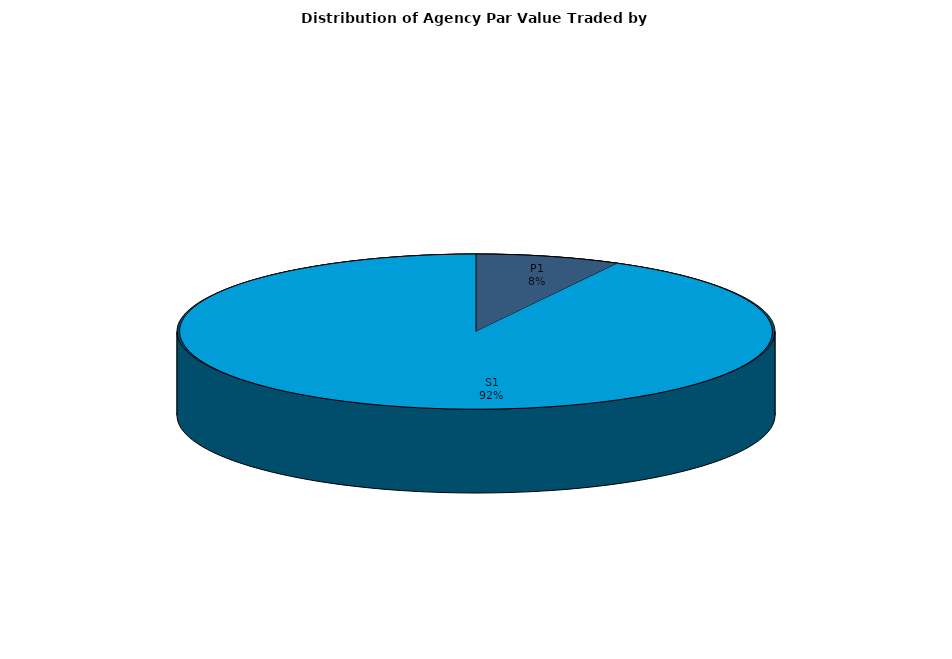
| Category | Series 0 |
|---|---|
| P1 | 275064335.96 |
| S1 | 3227512131.413 |